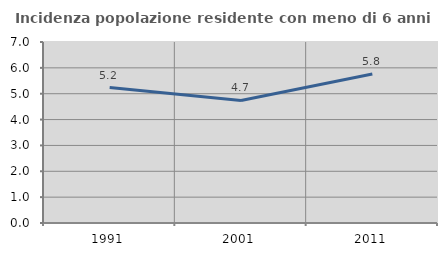
| Category | Incidenza popolazione residente con meno di 6 anni |
|---|---|
| 1991.0 | 5.236 |
| 2001.0 | 4.74 |
| 2011.0 | 5.763 |